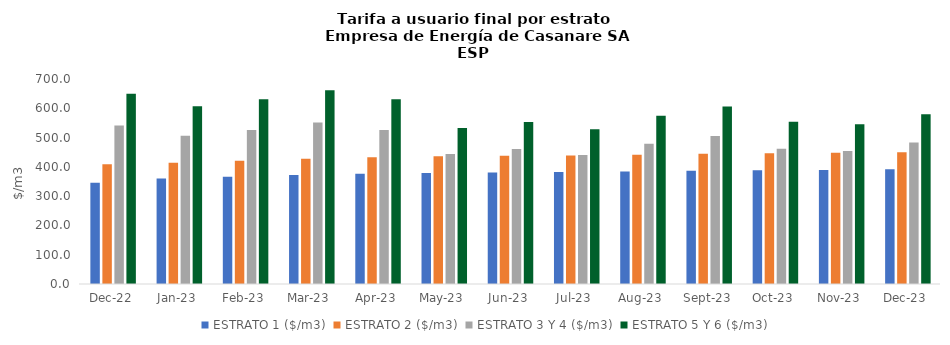
| Category | ESTRATO 1 ($/m3) | ESTRATO 2 ($/m3) | ESTRATO 3 Y 4 ($/m3) | ESTRATO 5 Y 6 ($/m3) |
|---|---|---|---|---|
| 2022-12-01 | 345.44 | 408.5 | 541.57 | 649.884 |
| 2023-01-01 | 359.93 | 413.65 | 505.984 | 607.18 |
| 2023-02-01 | 366.33 | 421 | 525.703 | 630.843 |
| 2023-03-01 | 372.41 | 428 | 551.417 | 661.7 |
| 2023-04-01 | 376.32 | 432.49 | 525.703 | 630.843 |
| 2023-05-01 | 379.26 | 435.87 | 444.034 | 532.841 |
| 2023-06-01 | 380.92 | 437.78 | 460.92 | 553.104 |
| 2023-07-01 | 382.06 | 439.09 | 440.108 | 528.13 |
| 2023-08-01 | 383.97 | 441.29 | 479.093 | 574.912 |
| 2023-09-01 | 386.66 | 444.37 | 505.302 | 606.362 |
| 2023-10-01 | 388.72 | 446.74 | 461.695 | 554.034 |
| 2023-11-01 | 389.69 | 447.85 | 454.34 | 545.208 |
| 2023-12-01 | 391.51 | 449.95 | 483.31 | 579.972 |